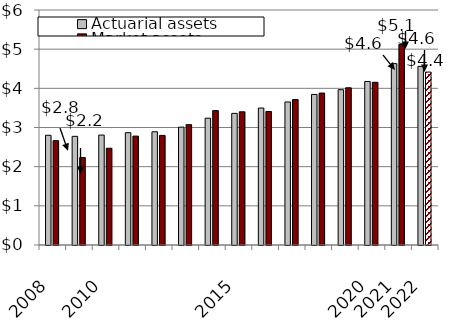
| Category | Actuarial assets | Market assets |
|---|---|---|
| 2008.0 | 2801483041.137 | 2663300874.265 |
| nan | 2774452696.612 | 2234021539.487 |
| 2010.0 | 2806262776.574 | 2470471628.72 |
| nan | 2867573324.396 | 2780237413.318 |
| nan | 2890948479.082 | 2797362741.992 |
| nan | 3009250921.847 | 3071963302.779 |
| nan | 3237697992.685 | 3431278783.427 |
| 2015.0 | 3360648799.092 | 3400821633.174 |
| nan | 3497184436.928 | 3409117225.557 |
| nan | 3651494538.355 | 3712359246.609 |
| nan | 3844366143.637 | 3879221952.777 |
| nan | 3965021378.746 | 4013515302.219 |
| 2020.0 | 4174767412.17 | 4154461547.109 |
| 2021.0 | 4631160914.617 | 5120766192.457 |
| 2022.0 | 4560671115.906 | 4415118278.768 |